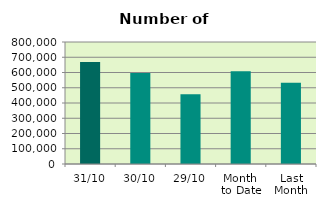
| Category | Series 0 |
|---|---|
| 31/10 | 669232 |
| 30/10 | 595962 |
| 29/10 | 457970 |
| Month 
to Date | 607838.609 |
| Last
Month | 533338.9 |